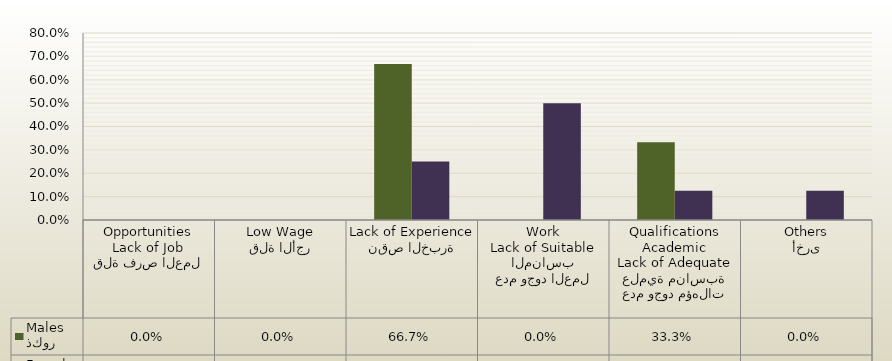
| Category | ذكور
Males | اناث
Females |
|---|---|---|
| قلة فرص العمل
Lack of Job Opportunities | 0 | 0 |
| قلة الأجر
Low Wage | 0 | 0 |
| نقص الخبرة
Lack of Experience | 0.667 | 0.25 |
| عدم وجود العمل المناسب
Lack of Suitable Work | 0 | 0.5 |
| عدم وجود مؤهلات علمية مناسبة
Lack of Adequate Academic Qualifications | 0.333 | 0.125 |
| أخرى
Others | 0 | 0.125 |